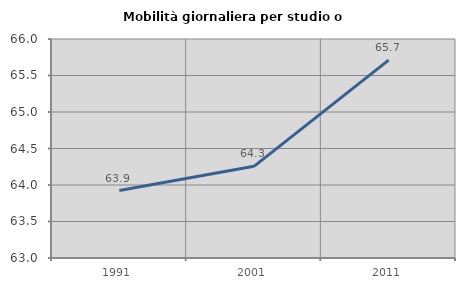
| Category | Mobilità giornaliera per studio o lavoro |
|---|---|
| 1991.0 | 63.925 |
| 2001.0 | 64.256 |
| 2011.0 | 65.71 |